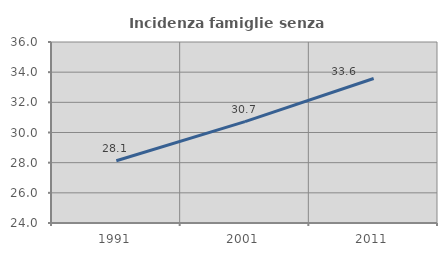
| Category | Incidenza famiglie senza nuclei |
|---|---|
| 1991.0 | 28.129 |
| 2001.0 | 30.717 |
| 2011.0 | 33.579 |